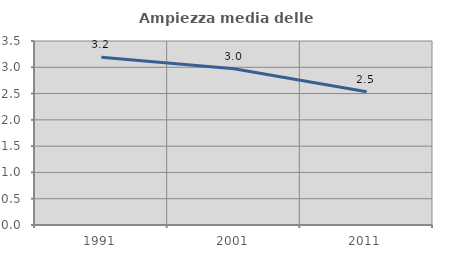
| Category | Ampiezza media delle famiglie |
|---|---|
| 1991.0 | 3.19 |
| 2001.0 | 2.973 |
| 2011.0 | 2.533 |